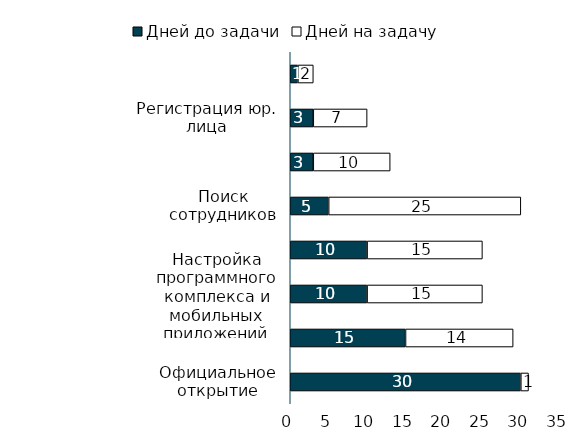
| Category | Дней до задачи | Дней на задачу |
|---|---|---|
| Официальное открытие | 30 | 1 |
| Старт маркетинговой кампании | 15 | 14 |
| Настройка программного комплекса и мобильных приложений | 10 | 15 |
| Покупка оборудования | 10 | 15 |
| Поиск сотрудников | 5 | 25 |
| Поиск помещения | 3 | 10 |
| Регистрация юр. лица | 3 | 7 |
| Заключение договора франчайзинга | 1 | 2 |